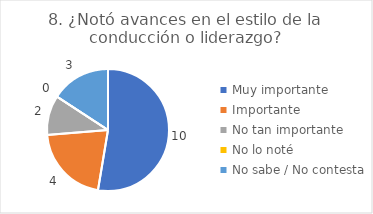
| Category | 8. ¿Notó avances en el estilo de la conducción o liderazgo? |
|---|---|
| Muy importante  | 0.526 |
| Importante  | 0.211 |
| No tan importante  | 0.105 |
| No lo noté  | 0 |
| No sabe / No contesta | 0.158 |